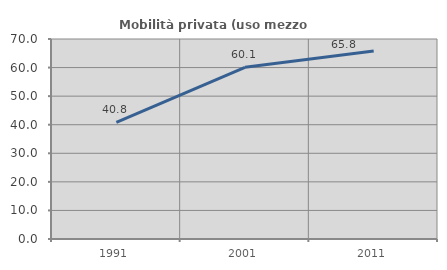
| Category | Mobilità privata (uso mezzo privato) |
|---|---|
| 1991.0 | 40.819 |
| 2001.0 | 60.11 |
| 2011.0 | 65.781 |